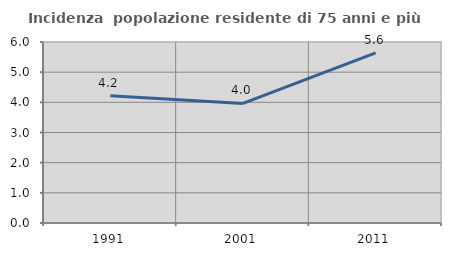
| Category | Incidenza  popolazione residente di 75 anni e più |
|---|---|
| 1991.0 | 4.216 |
| 2001.0 | 3.962 |
| 2011.0 | 5.642 |